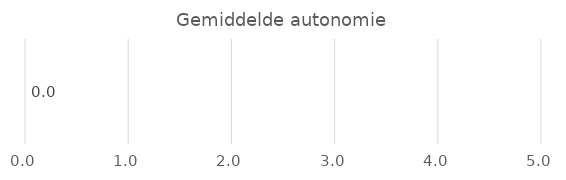
| Category | Series 0 |
|---|---|
| Autonomie | 0 |